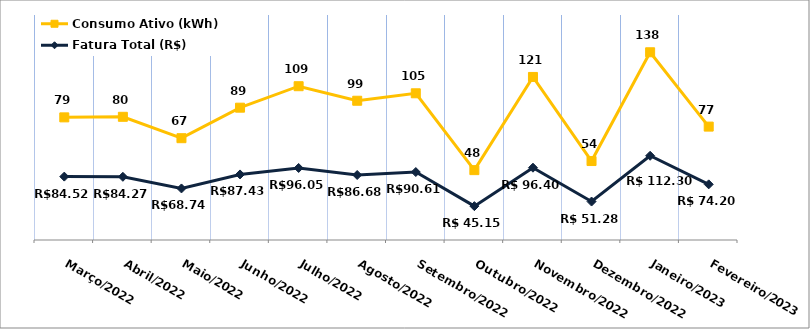
| Category | Fatura Total (R$) | Consumo Ativo (kWh) |
|---|---|---|
| Março/2022 | 84.52 | 79 |
| Abril/2022 | 84.27 | 80 |
| Maio/2022 | 68.74 | 67 |
| Junho/2022 | 87.43 | 89 |
| Julho/2022 | 96.05 | 109 |
| Agosto/2022 | 86.68 | 99 |
| Setembro/2022 | 90.61 | 105 |
| Outubro/2022 | 45.15 | 48 |
| Novembro/2022 | 96.4 | 121 |
| Dezembro/2022 | 51.28 | 54 |
| Janeiro/2023 | 112.3 | 138 |
| Fevereiro/2023 | 74.2 | 77 |